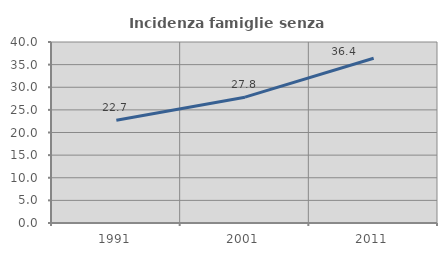
| Category | Incidenza famiglie senza nuclei |
|---|---|
| 1991.0 | 22.693 |
| 2001.0 | 27.81 |
| 2011.0 | 36.416 |